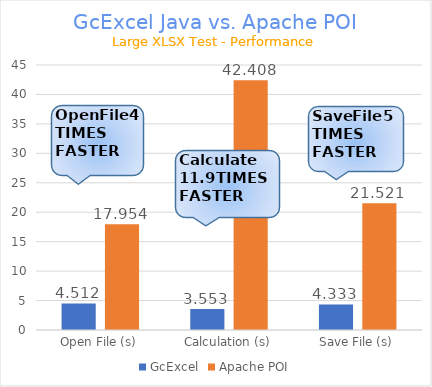
| Category | GcExcel | Apache POI |
|---|---|---|
| Open File (s) | 4.512 | 17.954 |
| Calculation (s) | 3.553 | 42.408 |
| Save File (s) | 4.333 | 21.521 |